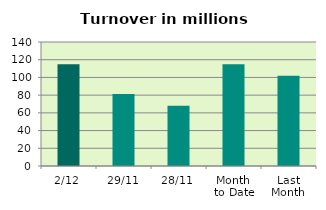
| Category | Series 0 |
|---|---|
| 2/12 | 114.944 |
| 29/11 | 81.163 |
| 28/11 | 67.905 |
| Month 
to Date | 114.944 |
| Last
Month | 101.866 |